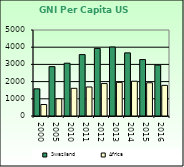
| Category | Swaziland | Africa                        |
|---|---|---|
| 2000.0 | 1580 | 668.557 |
| 2005.0 | 2870 | 1002.896 |
| 2010.0 | 3070 | 1608.999 |
| 2011.0 | 3570 | 1686.521 |
| 2012.0 | 3930 | 1885.129 |
| 2013.0 | 4010 | 1956.671 |
| 2014.0 | 3670 | 2022.289 |
| 2015.0 | 3280 | 1932.283 |
| 2016.0 | 2960 | 1781.415 |